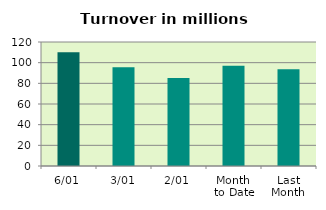
| Category | Series 0 |
|---|---|
| 6/01 | 110.032 |
| 3/01 | 95.446 |
| 2/01 | 85.211 |
| Month 
to Date | 96.896 |
| Last
Month | 93.592 |